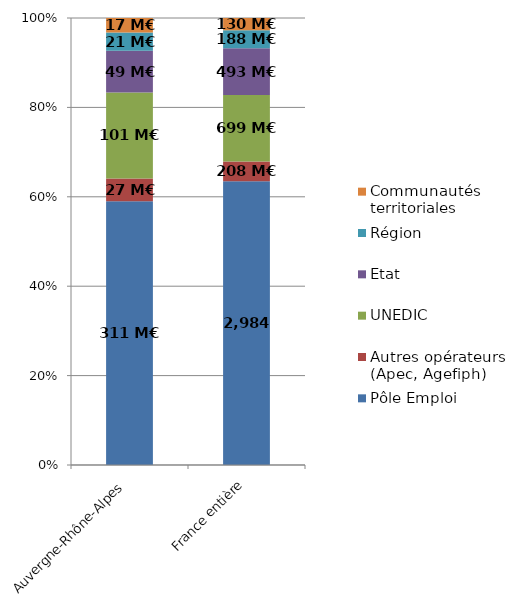
| Category | Pôle Emploi | Autres opérateurs (Apec, Agefiph) | UNEDIC | Etat | Région | Communautés territoriales |
|---|---|---|---|---|---|---|
| Auvergne-Rhône-Alpes | 310.635 | 26.702 | 101.289 | 49.193 | 21.415 | 17.096 |
| France entière | 2983.694 | 207.577 | 699.479 | 493.308 | 188.079 | 129.71 |